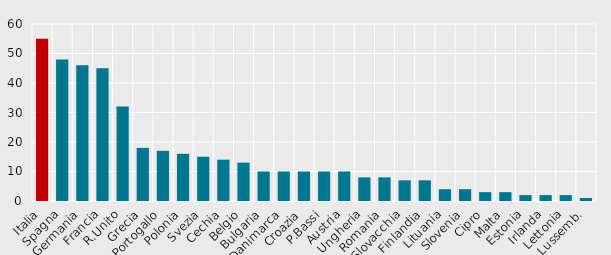
| Category | Totale |
|---|---|
| Italia | 55 |
| Spagna | 48 |
| Germania | 46 |
| Francia | 45 |
| R.Unito | 32 |
| Grecia | 18 |
| Portogallo | 17 |
| Polonia | 16 |
| Svezia | 15 |
| Cechia | 14 |
| Belgio | 13 |
| Bulgaria | 10 |
| Danimarca | 10 |
| Croazia | 10 |
| P.Bassi | 10 |
| Austria | 10 |
| Ungheria | 8 |
| Romania | 8 |
| Slovacchia | 7 |
| Finlandia | 7 |
| Lituania | 4 |
| Slovenia | 4 |
| Cipro | 3 |
| Malta | 3 |
| Estonia | 2 |
| Irlanda | 2 |
| Lettonia | 2 |
| Lussemb. | 1 |